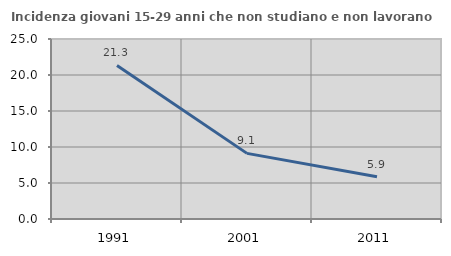
| Category | Incidenza giovani 15-29 anni che non studiano e non lavorano  |
|---|---|
| 1991.0 | 21.327 |
| 2001.0 | 9.114 |
| 2011.0 | 5.854 |